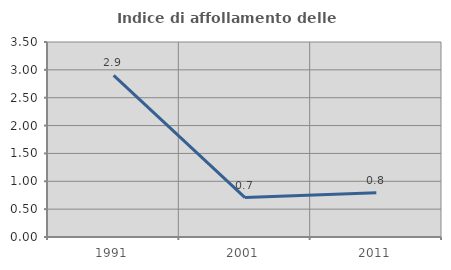
| Category | Indice di affollamento delle abitazioni  |
|---|---|
| 1991.0 | 2.901 |
| 2001.0 | 0.708 |
| 2011.0 | 0.792 |